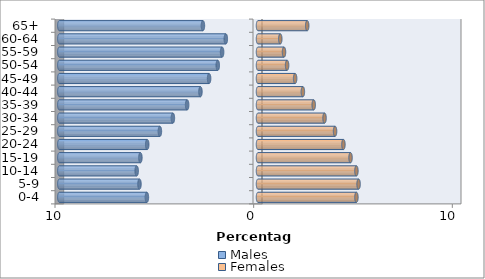
| Category | Males | Females |
|---|---|---|
| 0-4 | -5.593 | 4.954 |
| 5-9 | -5.967 | 5.063 |
| 10-14 | -6.107 | 4.954 |
| 15-19 | -5.92 | 4.658 |
| 20-24 | -5.577 | 4.3 |
| 25-29 | -4.938 | 3.879 |
| 30-34 | -4.284 | 3.349 |
| 35-39 | -3.568 | 2.804 |
| 40-44 | -2.898 | 2.259 |
| 45-49 | -2.461 | 1.869 |
| 50-54 | -2.025 | 1.464 |
| 55-59 | -1.807 | 1.309 |
| 60-64 | -1.62 | 1.122 |
| 65+ | -2.773 | 2.477 |